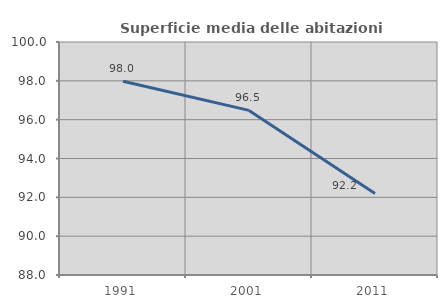
| Category | Superficie media delle abitazioni occupate |
|---|---|
| 1991.0 | 97.982 |
| 2001.0 | 96.478 |
| 2011.0 | 92.202 |